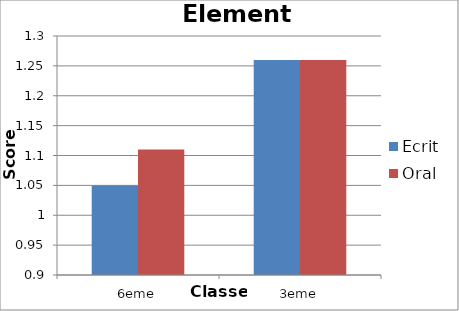
| Category | Ecrit | Oral |
|---|---|---|
| 6eme | 1.05 | 1.11 |
| 3eme | 1.26 | 1.26 |